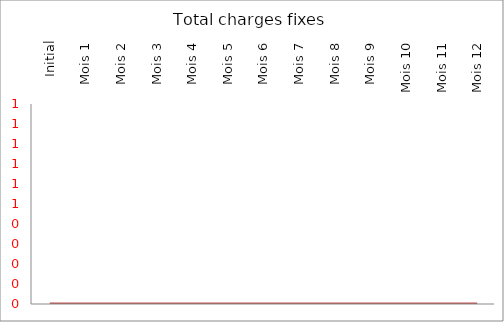
| Category | Total charges fixes |
|---|---|
| Initial | 0 |
| Mois 1 | 0 |
| Mois 2 | 0 |
| Mois 3 | 0 |
| Mois 4 | 0 |
| Mois 5 | 0 |
| Mois 6 | 0 |
| Mois 7 | 0 |
| Mois 8 | 0 |
| Mois 9 | 0 |
| Mois 10 | 0 |
| Mois 11 | 0 |
| Mois 12 | 0 |